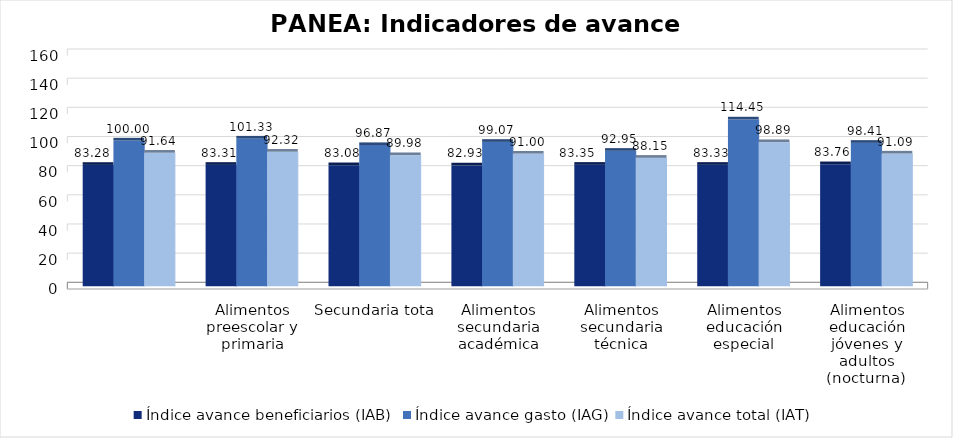
| Category | Índice avance beneficiarios (IAB)  | Índice avance gasto (IAG) | Índice avance total (IAT)  |
|---|---|---|---|
|  | 83.282 | 100 | 91.641 |
| Alimentos preescolar y primaria | 83.31 | 101.332 | 92.321 |
| Secundaria total | 83.08 | 96.874 | 89.977 |
| Alimentos secundaria académica | 82.925 | 99.074 | 91 |
| Alimentos secundaria técnica | 83.352 | 92.952 | 88.152 |
| Alimentos educación especial | 83.333 | 114.446 | 98.89 |
| Alimentos educación jóvenes y adultos (nocturna)  | 83.757 | 98.413 | 91.085 |